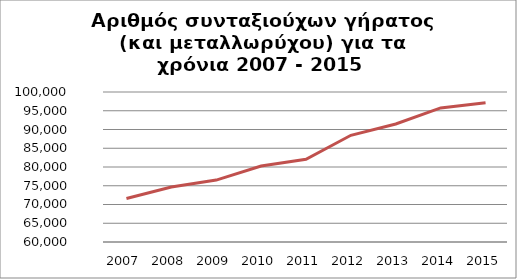
| Category | Series 1 |
|---|---|
| 2007.0 | 71621 |
| 2008.0 | 74642 |
| 2009.0 | 76508 |
| 2010.0 | 80261 |
| 2011.0 | 82038 |
| 2012.0 | 88453 |
| 2013.0 | 91472 |
| 2014.0 | 95747 |
| 2015.0 | 97134 |